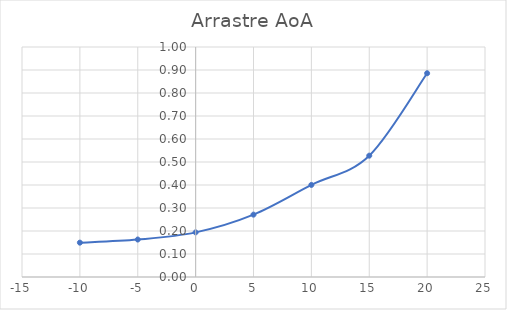
| Category | Series 0 |
|---|---|
| -10.0 | 0.149 |
| -5.0 | 0.163 |
| 0.0 | 0.194 |
| 5.0 | 0.271 |
| 10.0 | 0.4 |
| 15.0 | 0.528 |
| 20.0 | 0.886 |